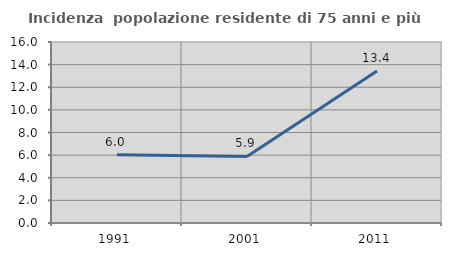
| Category | Incidenza  popolazione residente di 75 anni e più |
|---|---|
| 1991.0 | 6.03 |
| 2001.0 | 5.882 |
| 2011.0 | 13.441 |